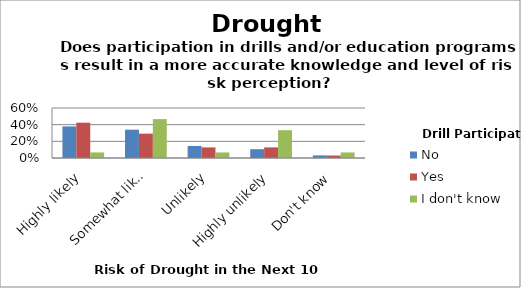
| Category | No | Yes | I don't know |
|---|---|---|---|
| Highly likely | 0.379 | 0.424 | 0.067 |
| Somewhat likely | 0.34 | 0.292 | 0.467 |
| Unlikely | 0.145 | 0.127 | 0.067 |
| Highly unlikely | 0.105 | 0.127 | 0.333 |
| Don't know | 0.031 | 0.03 | 0.067 |